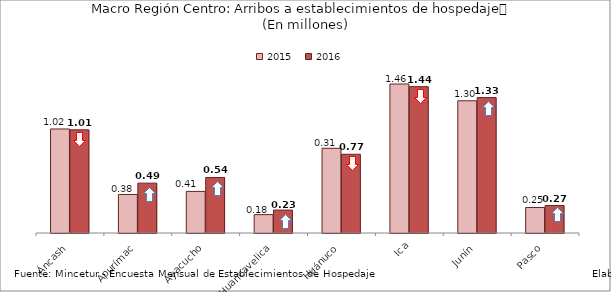
| Category | 2015 | 2016 |
|---|---|---|
| Áncash | 1.021 | 1.013 |
| Apurímac | 0.378 | 0.49 |
| Ayacucho | 0.408 | 0.545 |
| Huancavelica | 0.18 | 0.225 |
| Huánuco | 0.832 | 0.773 |
| Ica | 1.463 | 1.437 |
| Junín | 1.298 | 1.329 |
| Pasco | 0.25 | 0.27 |